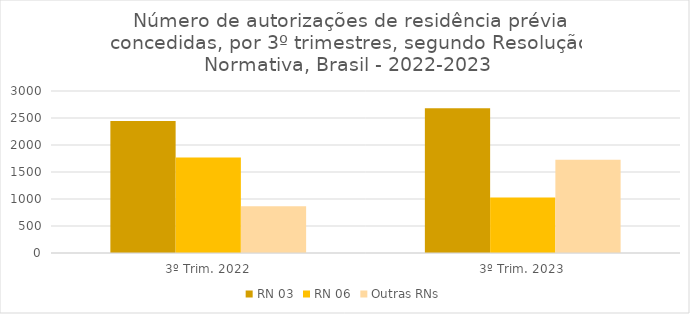
| Category | RN 03 | RN 06 | Outras RNs |
|---|---|---|---|
| 3º Trim. 2022 | 2443 | 1768 | 864 |
| 3º Trim. 2023 | 2679 | 1030 | 1728 |